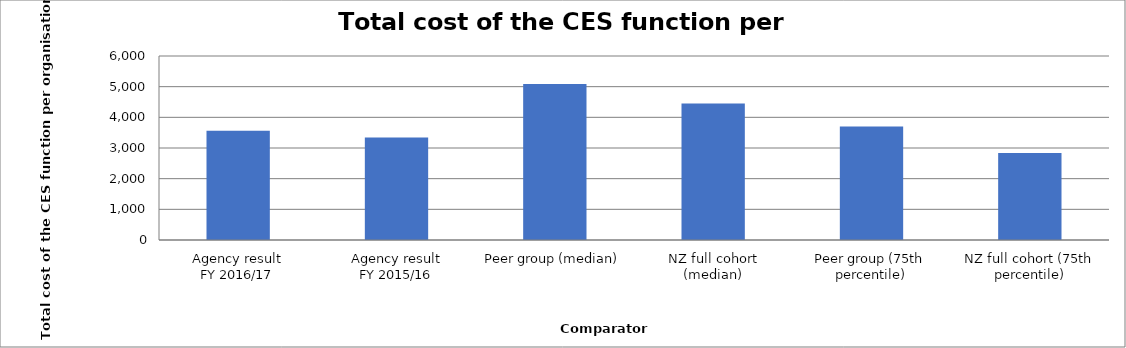
| Category | Result |
|---|---|
| Agency result
FY 2016/17 | 3566.284 |
| Agency result
FY 2015/16 | 3343.62 |
| Peer group (median) | 5089.243 |
| NZ full cohort (median) | 4447.38 |
| Peer group (75th percentile) | 3703.838 |
| NZ full cohort (75th percentile) | 2835.066 |